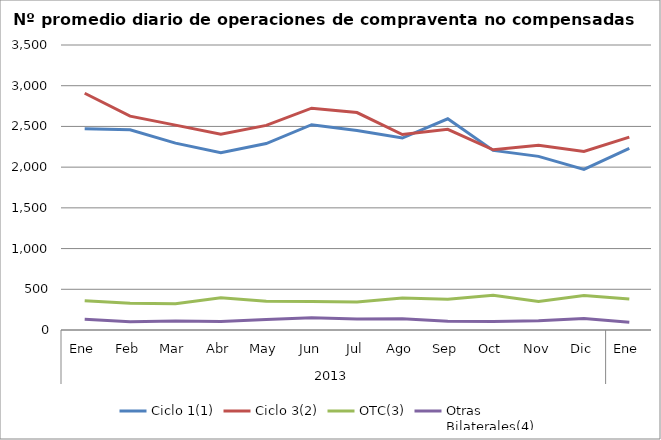
| Category | Ciclo 1(1) | Ciclo 3(2) | OTC(3) | Otras
Bilaterales(4) |
|---|---|---|---|---|
| 0 | 2472.091 | 2907.273 | 357.864 | 131.409 |
| 1 | 2459.8 | 2626.25 | 327.5 | 100.6 |
| 2 | 2294.6 | 2516 | 323.75 | 111.65 |
| 3 | 2176.182 | 2403.364 | 394.818 | 103.364 |
| 4 | 2290.048 | 2512.714 | 352.095 | 130.143 |
| 5 | 2520.75 | 2724.25 | 349.7 | 151.05 |
| 6 | 2449.045 | 2670.182 | 344.818 | 134.5 |
| 7 | 2357.333 | 2400.048 | 392.524 | 137.571 |
| 8 | 2593.778 | 2465 | 376.889 | 108.389 |
| 9 | 2205.955 | 2213.318 | 425.318 | 105.636 |
| 10 | 2132.1 | 2268.1 | 350 | 113.75 |
| 11 | 1972.35 | 2191.55 | 424.35 | 141.55 |
| 12 | 2231.227 | 2368.955 | 379.864 | 95 |